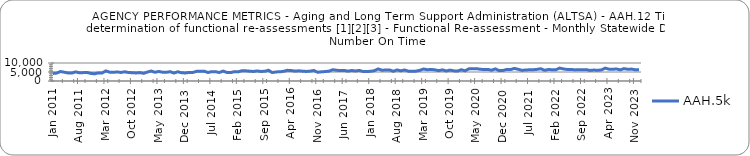
| Category | AAH.5k |
|---|---|
| 2011-01-01 | 4164 |
| 2011-02-01 | 4396 |
| 2011-03-01 | 5253 |
| 2011-04-01 | 4896 |
| 2011-05-01 | 4475 |
| 2011-06-01 | 4397 |
| 2011-07-01 | 5061 |
| 2011-08-01 | 4592 |
| 2011-09-01 | 4647 |
| 2011-10-01 | 4745 |
| 2011-11-01 | 4235 |
| 2011-12-01 | 3995 |
| 2012-01-01 | 4500 |
| 2012-02-01 | 4435 |
| 2012-03-01 | 5601 |
| 2012-04-01 | 4916 |
| 2012-05-01 | 4798 |
| 2012-06-01 | 5063 |
| 2012-07-01 | 4739 |
| 2012-08-01 | 5119 |
| 2012-09-01 | 4710 |
| 2012-10-01 | 4609 |
| 2012-11-01 | 4477 |
| 2012-12-01 | 4666 |
| 2013-01-01 | 4274 |
| 2013-02-01 | 4993 |
| 2013-03-01 | 5554 |
| 2013-04-01 | 4852 |
| 2013-05-01 | 5314 |
| 2013-06-01 | 4871 |
| 2013-07-01 | 4831 |
| 2013-08-01 | 5191 |
| 2013-09-01 | 4417 |
| 2013-10-01 | 5130 |
| 2013-11-01 | 4594 |
| 2013-12-01 | 4462 |
| 2014-01-01 | 4764 |
| 2014-02-01 | 4765 |
| 2014-03-01 | 5361 |
| 2014-04-01 | 5423 |
| 2014-05-01 | 5484 |
| 2014-06-01 | 4722 |
| 2014-07-01 | 5207 |
| 2014-08-01 | 5173 |
| 2014-09-01 | 4705 |
| 2014-10-01 | 5519 |
| 2014-11-01 | 4759 |
| 2014-12-01 | 4659 |
| 2015-01-01 | 5207 |
| 2015-02-01 | 5092 |
| 2015-03-01 | 5715 |
| 2015-04-01 | 5664 |
| 2015-05-01 | 5448 |
| 2015-06-01 | 5297 |
| 2015-07-01 | 5587 |
| 2015-08-01 | 5312 |
| 2015-09-01 | 5383 |
| 2015-10-01 | 5965 |
| 2015-11-01 | 4684 |
| 2015-12-01 | 5052 |
| 2016-01-01 | 5105 |
| 2016-02-01 | 5383 |
| 2016-03-01 | 5924 |
| 2016-04-01 | 5838 |
| 2016-05-01 | 5478 |
| 2016-06-01 | 5668 |
| 2016-07-01 | 5464 |
| 2016-08-01 | 5313 |
| 2016-09-01 | 5483 |
| 2016-10-01 | 5828 |
| 2016-11-01 | 4863 |
| 2016-12-01 | 5099 |
| 2017-01-01 | 5246 |
| 2017-02-01 | 5468 |
| 2017-03-01 | 6270 |
| 2017-04-01 | 5972 |
| 2017-05-01 | 5794 |
| 2017-06-01 | 5894 |
| 2017-07-01 | 5456 |
| 2017-08-01 | 5824 |
| 2017-09-01 | 5570 |
| 2017-10-01 | 5879 |
| 2017-11-01 | 5286 |
| 2017-12-01 | 5285 |
| 2018-01-01 | 5378 |
| 2018-02-01 | 5730 |
| 2018-03-01 | 6705 |
| 2018-04-01 | 6006 |
| 2018-05-01 | 6077 |
| 2018-06-01 | 6168 |
| 2018-07-01 | 5398 |
| 2018-08-01 | 6134 |
| 2018-09-01 | 5665 |
| 2018-10-01 | 6113 |
| 2018-11-01 | 5449 |
| 2018-12-01 | 5386 |
| 2019-01-01 | 5480 |
| 2019-02-01 | 5899 |
| 2019-03-01 | 6664 |
| 2019-04-01 | 6265 |
| 2019-05-01 | 6439 |
| 2019-06-01 | 6199 |
| 2019-07-01 | 5754 |
| 2019-08-01 | 6198 |
| 2019-09-01 | 5569 |
| 2019-10-01 | 6058 |
| 2019-11-01 | 5634 |
| 2019-12-01 | 5532 |
| 2020-01-01 | 6247 |
| 2020-02-01 | 5656 |
| 2020-03-01 | 6763 |
| 2020-04-01 | 6789 |
| 2020-05-01 | 6860 |
| 2020-06-01 | 6508 |
| 2020-07-01 | 6379 |
| 2020-08-01 | 6435 |
| 2020-09-01 | 5984 |
| 2020-10-01 | 6715 |
| 2020-11-01 | 5756 |
| 2020-12-01 | 5874 |
| 2021-01-01 | 6394 |
| 2021-02-01 | 6341 |
| 2021-03-01 | 6999 |
| 2021-04-01 | 6503 |
| 2021-05-01 | 5930 |
| 2021-06-01 | 6129 |
| 2021-07-01 | 6218 |
| 2021-08-01 | 6242 |
| 2021-09-01 | 6462 |
| 2021-10-01 | 6818 |
| 2021-11-01 | 5948 |
| 2021-12-01 | 6375 |
| 2022-01-01 | 6277 |
| 2022-02-01 | 6257 |
| 2022-03-01 | 7168 |
| 2022-04-01 | 6686 |
| 2022-05-01 | 6402 |
| 2022-06-01 | 6456 |
| 2022-07-01 | 6168 |
| 2022-08-01 | 6270 |
| 2022-09-01 | 6215 |
| 2022-10-01 | 6322 |
| 2022-11-01 | 5870 |
| 2022-12-01 | 6082 |
| 2023-01-01 | 5960 |
| 2023-02-01 | 6119 |
| 2023-03-01 | 7152 |
| 2023-04-01 | 6569 |
| 2023-05-01 | 6503 |
| 2023-06-01 | 6697 |
| 2023-07-01 | 6189 |
| 2023-08-01 | 6858 |
| 2023-09-01 | 6508 |
| 2023-10-01 | 6613 |
| 2023-11-01 | 6224 |
| 2023-12-01 | 6203 |